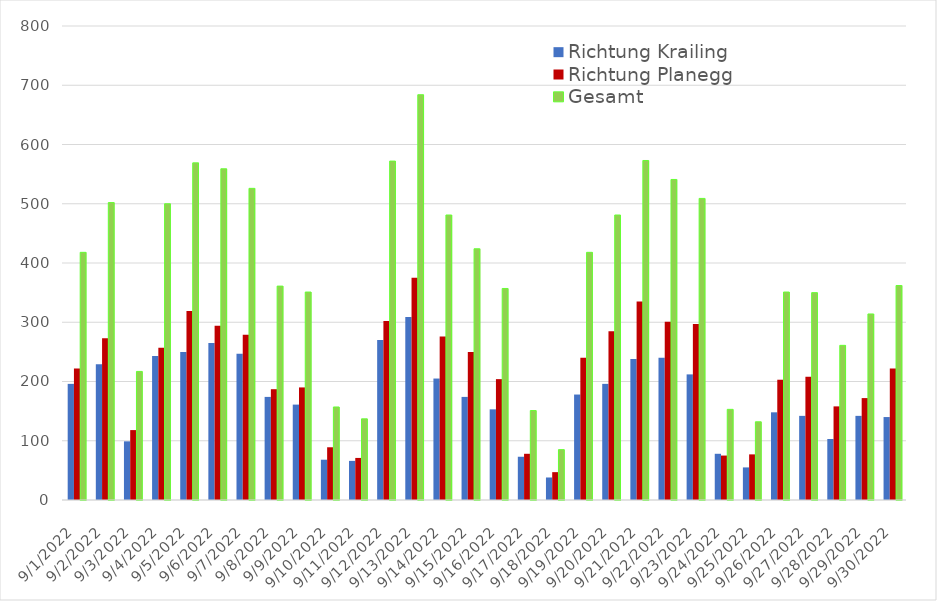
| Category | Richtung Krailing | Richtung Planegg | Gesamt |
|---|---|---|---|
| 9/1/22 | 196 | 222 | 418 |
| 9/2/22 | 229 | 273 | 502 |
| 9/3/22 | 99 | 118 | 217 |
| 9/4/22 | 243 | 257 | 500 |
| 9/5/22 | 250 | 319 | 569 |
| 9/6/22 | 265 | 294 | 559 |
| 9/7/22 | 247 | 279 | 526 |
| 9/8/22 | 174 | 187 | 361 |
| 9/9/22 | 161 | 190 | 351 |
| 9/10/22 | 68 | 89 | 157 |
| 9/11/22 | 66 | 71 | 137 |
| 9/12/22 | 270 | 302 | 572 |
| 9/13/22 | 309 | 375 | 684 |
| 9/14/22 | 205 | 276 | 481 |
| 9/15/22 | 174 | 250 | 424 |
| 9/16/22 | 153 | 204 | 357 |
| 9/17/22 | 73 | 78 | 151 |
| 9/18/22 | 38 | 47 | 85 |
| 9/19/22 | 178 | 240 | 418 |
| 9/20/22 | 196 | 285 | 481 |
| 9/21/22 | 238 | 335 | 573 |
| 9/22/22 | 240 | 301 | 541 |
| 9/23/22 | 212 | 297 | 509 |
| 9/24/22 | 78 | 75 | 153 |
| 9/25/22 | 55 | 77 | 132 |
| 9/26/22 | 148 | 203 | 351 |
| 9/27/22 | 142 | 208 | 350 |
| 9/28/22 | 103 | 158 | 261 |
| 9/29/22 | 142 | 172 | 314 |
| 9/30/22 | 140 | 222 | 362 |